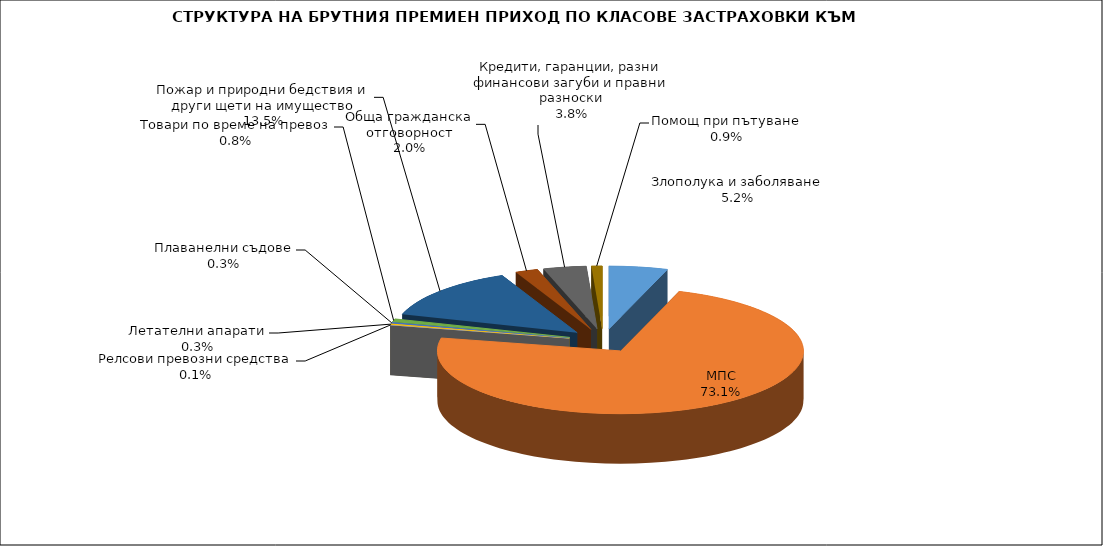
| Category | Злополука и заболяване |
|---|---|
| Злополука и заболяване | 0.052 |
| МПС | 0.731 |
| Релсови превозни средства | 0.001 |
| Летателни апарати | 0.003 |
| Плаванелни съдове | 0.003 |
| Товари по време на превоз | 0.008 |
| Пожар и природни бедствия и други щети на имущество | 0.135 |
| Обща гражданска отговорност | 0.02 |
| Кредити, гаранции, разни финансови загуби и правни разноски | 0.038 |
| Помощ при пътуване | 0.009 |